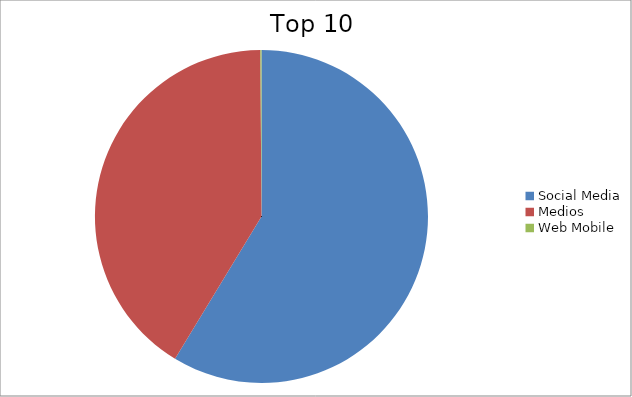
| Category | Series 0 |
|---|---|
| Social Media | 58.69 |
| Medios | 41.2 |
| Web Mobile | 0.11 |